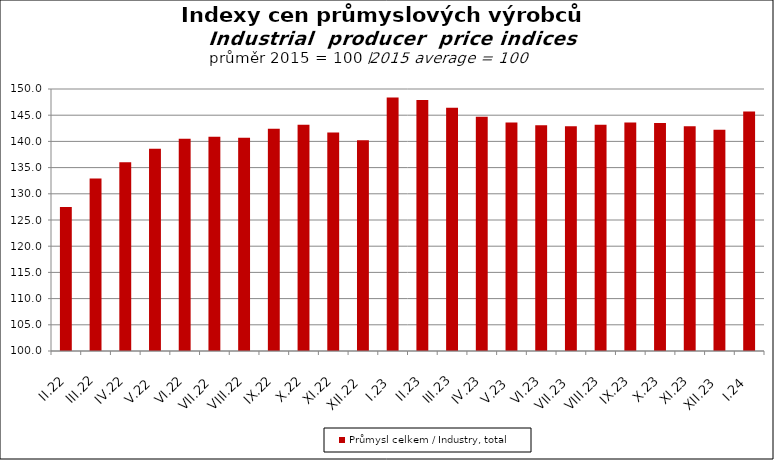
| Category | Průmysl celkem / Industry, total |
|---|---|
| II.22 | 127.5 |
| III.22 | 132.9 |
| IV.22 | 136 |
| V.22 | 138.6 |
| VI.22 | 140.5 |
| VII.22 | 140.9 |
| VIII.22 | 140.7 |
| IX.22 | 142.4 |
| X.22 | 143.2 |
| XI.22 | 141.7 |
| XII.22 | 140.2 |
| I.23 | 148.4 |
| II.23 | 147.9 |
| III.23 | 146.4 |
| IV.23 | 144.7 |
| V.23 | 143.6 |
| VI.23 | 143.1 |
| VII.23 | 142.9 |
| VIII.23 | 143.2 |
| IX.23 | 143.6 |
| X.23 | 143.5 |
| XI.23 | 142.9 |
| XII.23 | 142.2 |
| I.24 | 145.7 |